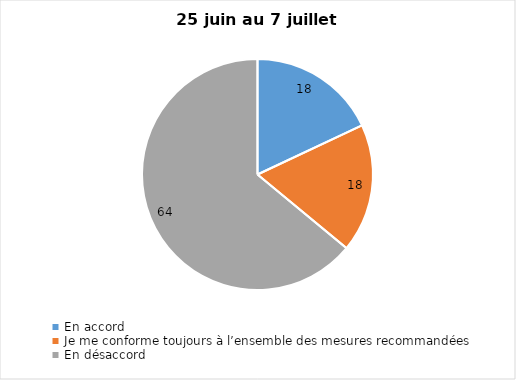
| Category | Series 0 |
|---|---|
| En accord | 18 |
| Je me conforme toujours à l’ensemble des mesures recommandées | 18 |
| En désaccord | 64 |